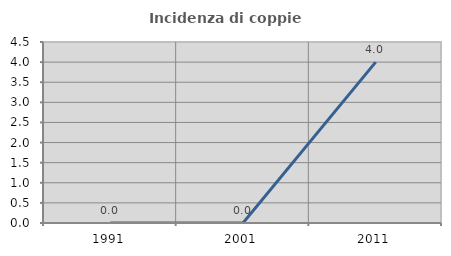
| Category | Incidenza di coppie miste |
|---|---|
| 1991.0 | 0 |
| 2001.0 | 0 |
| 2011.0 | 4 |